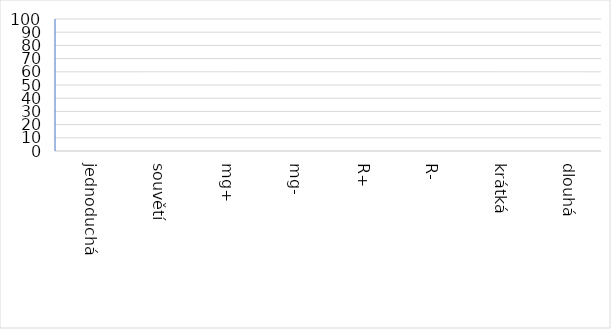
| Category | Series 1 |
|---|---|
| jednoduchá | 0 |
| souvětí | 0 |
| mg+ | 0 |
| mg- | 0 |
| R+ | 0 |
| R- | 0 |
| krátká | 0 |
| dlouhá | 0 |